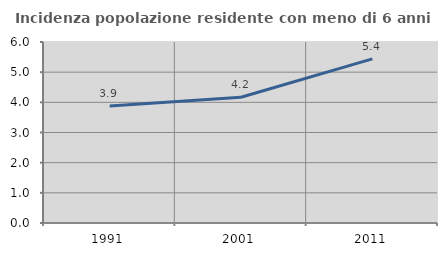
| Category | Incidenza popolazione residente con meno di 6 anni |
|---|---|
| 1991.0 | 3.877 |
| 2001.0 | 4.167 |
| 2011.0 | 5.439 |